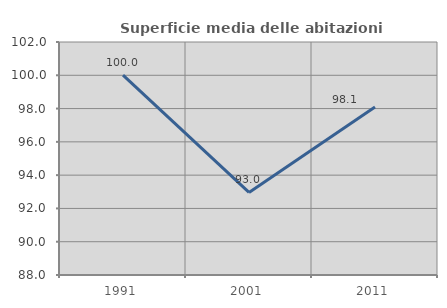
| Category | Superficie media delle abitazioni occupate |
|---|---|
| 1991.0 | 100.009 |
| 2001.0 | 92.963 |
| 2011.0 | 98.093 |